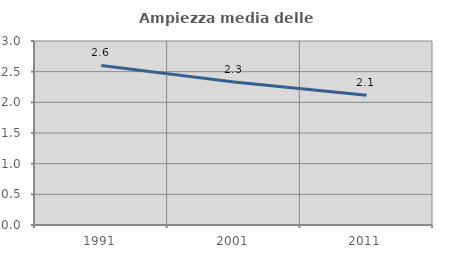
| Category | Ampiezza media delle famiglie |
|---|---|
| 1991.0 | 2.601 |
| 2001.0 | 2.33 |
| 2011.0 | 2.115 |